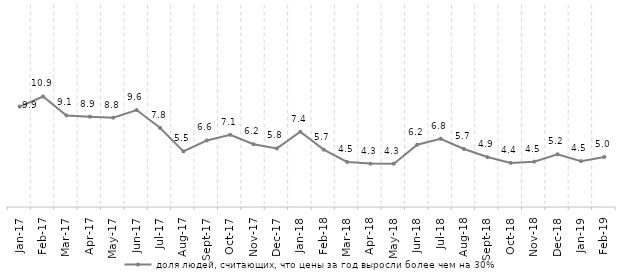
| Category | доля людей, считающих, что цены за год выросли более чем на 30% |
|---|---|
| 2017-01-01 | 9.946 |
| 2017-02-01 | 10.942 |
| 2017-03-01 | 9.066 |
| 2017-04-01 | 8.939 |
| 2017-05-01 | 8.844 |
| 2017-06-01 | 9.6 |
| 2017-07-01 | 7.841 |
| 2017-08-01 | 5.509 |
| 2017-09-01 | 6.587 |
| 2017-10-01 | 7.147 |
| 2017-11-01 | 6.218 |
| 2017-12-01 | 5.8 |
| 2018-01-01 | 7.445 |
| 2018-02-01 | 5.682 |
| 2018-03-01 | 4.463 |
| 2018-04-01 | 4.296 |
| 2018-05-01 | 4.287 |
| 2018-06-01 | 6.164 |
| 2018-07-01 | 6.758 |
| 2018-08-01 | 5.744 |
| 2018-09-01 | 4.946 |
| 2018-10-01 | 4.368 |
| 2018-11-01 | 4.491 |
| 2018-12-01 | 5.219 |
| 2019-01-01 | 4.543 |
| 2019-02-01 | 4.953 |